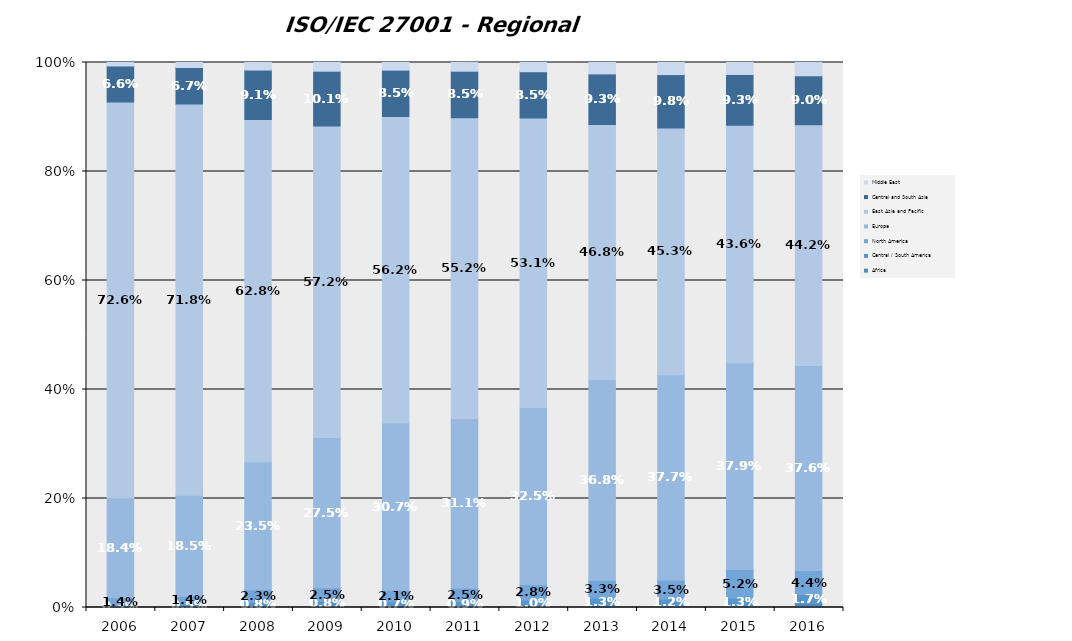
| Category | Africa | Central / South America       | North America | Europe | East Asia and Pacific | Central and South Asia | Middle East |
|---|---|---|---|---|---|---|---|
| 2006.0 | 0.001 | 0.003 | 0.014 | 0.184 | 0.726 | 0.066 | 0.006 |
| 2007.0 | 0.001 | 0.005 | 0.014 | 0.185 | 0.718 | 0.067 | 0.009 |
| 2008.0 | 0.002 | 0.008 | 0.023 | 0.235 | 0.628 | 0.091 | 0.014 |
| 2009.0 | 0.004 | 0.008 | 0.025 | 0.275 | 0.572 | 0.101 | 0.016 |
| 2010.0 | 0.003 | 0.007 | 0.021 | 0.307 | 0.562 | 0.085 | 0.014 |
| 2011.0 | 0.002 | 0.009 | 0.025 | 0.311 | 0.552 | 0.085 | 0.016 |
| 2012.0 | 0.003 | 0.01 | 0.028 | 0.325 | 0.531 | 0.085 | 0.017 |
| 2013.0 | 0.005 | 0.013 | 0.033 | 0.368 | 0.468 | 0.093 | 0.021 |
| 2014.0 | 0.003 | 0.012 | 0.035 | 0.377 | 0.453 | 0.098 | 0.022 |
| 2015.0 | 0.005 | 0.013 | 0.052 | 0.379 | 0.436 | 0.093 | 0.022 |
| 2016.0 | 0.007 | 0.017 | 0.044 | 0.376 | 0.442 | 0.09 | 0.024 |